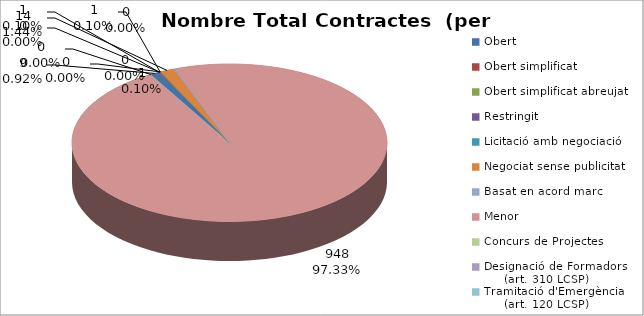
| Category | Nombre Total Contractes |
|---|---|
| Obert | 9 |
| Obert simplificat | 1 |
| Obert simplificat abreujat | 0 |
| Restringit | 1 |
| Licitació amb negociació | 0 |
| Negociat sense publicitat | 14 |
| Basat en acord marc | 1 |
| Menor | 948 |
| Concurs de Projectes | 0 |
| Designació de Formadors
     (art. 310 LCSP) | 0 |
| Tramitació d'Emergència
     (art. 120 LCSP) | 0 |